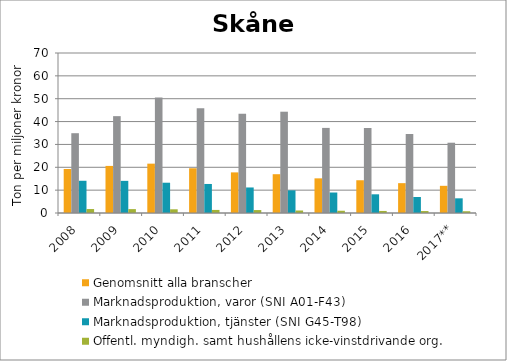
| Category | Genomsnitt alla branscher | Marknadsproduktion, varor (SNI A01-F43) | Marknadsproduktion, tjänster (SNI G45-T98) | Offentl. myndigh. samt hushållens icke-vinstdrivande org. |
|---|---|---|---|---|
| 2008 | 19.26 | 34.91 | 14.1 | 1.731 |
| 2009 | 20.598 | 42.374 | 14.065 | 1.699 |
| 2010 | 21.589 | 50.533 | 13.25 | 1.619 |
| 2011 | 19.577 | 45.847 | 12.702 | 1.344 |
| 2012 | 17.766 | 43.421 | 11.17 | 1.283 |
| 2013 | 16.969 | 44.317 | 9.912 | 1.093 |
| 2014 | 15.159 | 37.23 | 8.963 | 0.987 |
| 2015 | 14.328 | 37.228 | 8.177 | 0.898 |
| 2016 | 13.057 | 34.554 | 6.999 | 0.854 |
| 2017** | 11.893 | 30.753 | 6.42 | 0.767 |